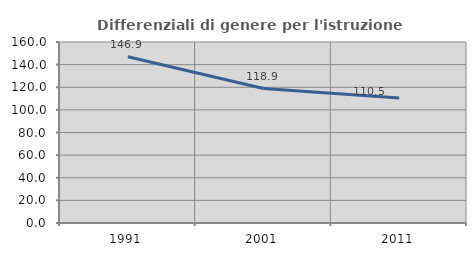
| Category | Differenziali di genere per l'istruzione superiore |
|---|---|
| 1991.0 | 146.9 |
| 2001.0 | 118.867 |
| 2011.0 | 110.47 |